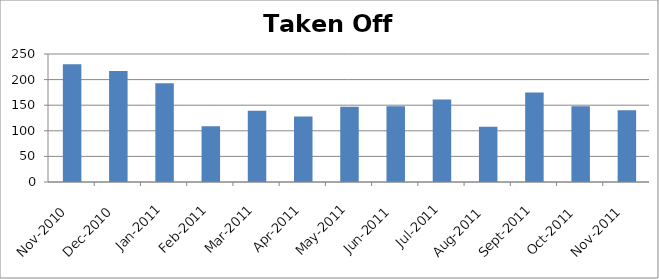
| Category | Series 0 |
|---|---|
| 2010-11-01 | 230 |
| 2010-12-01 | 217 |
| 2011-01-01 | 193 |
| 2011-02-01 | 109 |
| 2011-03-01 | 139 |
| 2011-04-01 | 128 |
| 2011-05-01 | 147 |
| 2011-06-01 | 148 |
| 2011-07-01 | 161 |
| 2011-08-01 | 108 |
| 2011-09-01 | 175 |
| 2011-10-01 | 148 |
| 2011-11-01 | 140 |